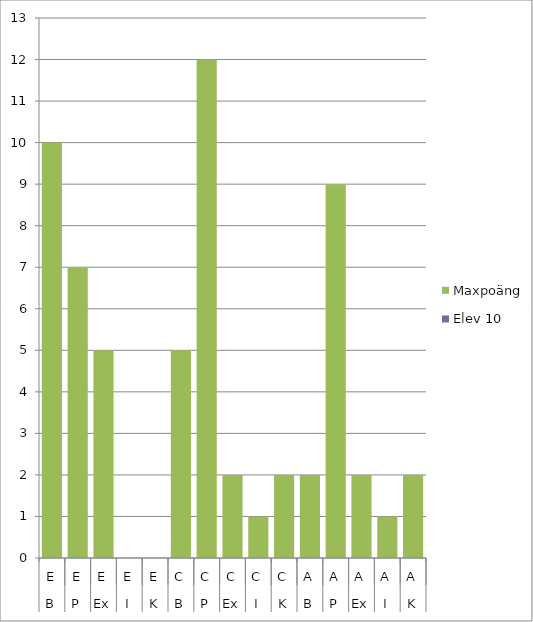
| Category | Maxpoäng | Elev 10 |
|---|---|---|
| 0 | 10 | 0 |
| 1 | 7 | 0 |
| 2 | 5 | 0 |
| 3 | 0 | 0 |
| 4 | 0 | 0 |
| 5 | 5 | 0 |
| 6 | 12 | 0 |
| 7 | 2 | 0 |
| 8 | 1 | 0 |
| 9 | 2 | 0 |
| 10 | 2 | 0 |
| 11 | 9 | 0 |
| 12 | 2 | 0 |
| 13 | 1 | 0 |
| 14 | 2 | 0 |